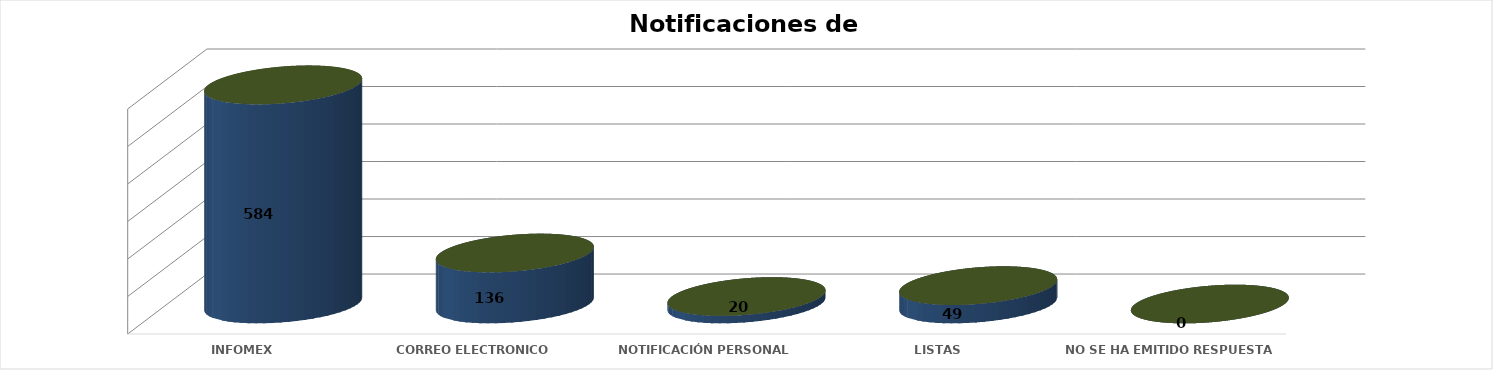
| Category | Series 0 | Series 1 | Series 2 | Series 3 | Series 4 |
|---|---|---|---|---|---|
| INFOMEX |  |  |  | 584 | 0.74 |
| CORREO ELECTRONICO |  |  |  | 136 | 0.172 |
| NOTIFICACIÓN PERSONAL |  |  |  | 20 | 0.025 |
| LISTAS |  |  |  | 49 | 0.062 |
|  NO SE HA EMITIDO RESPUESTA |  |  |  | 0 | 0 |